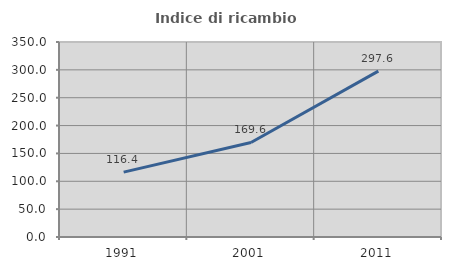
| Category | Indice di ricambio occupazionale  |
|---|---|
| 1991.0 | 116.393 |
| 2001.0 | 169.643 |
| 2011.0 | 297.619 |